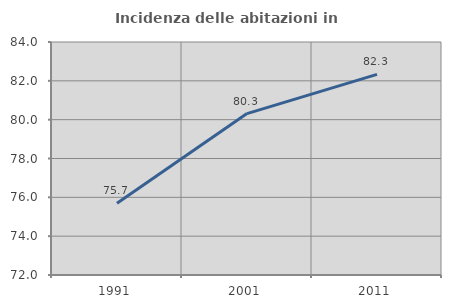
| Category | Incidenza delle abitazioni in proprietà  |
|---|---|
| 1991.0 | 75.692 |
| 2001.0 | 80.314 |
| 2011.0 | 82.335 |